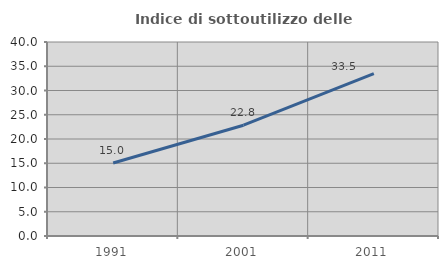
| Category | Indice di sottoutilizzo delle abitazioni  |
|---|---|
| 1991.0 | 15.047 |
| 2001.0 | 22.841 |
| 2011.0 | 33.5 |